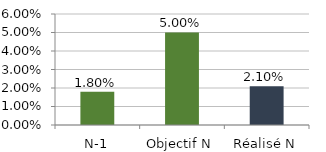
| Category | Series 0 |
|---|---|
| N-1 | 0.018 |
| Objectif N | 0.05 |
| Réalisé N | 0.021 |